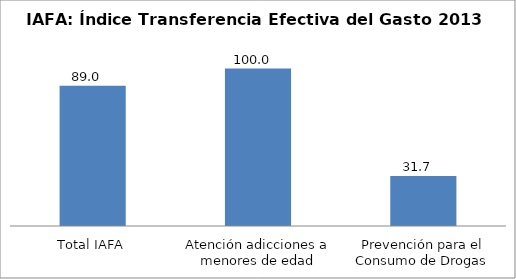
| Category | Índice transferencia efectiva del gasto (ITG) |
|---|---|
| Total IAFA | 89.011 |
| Atención adicciones a menores de edad | 100 |
| Prevención para el Consumo de Drogas | 31.703 |